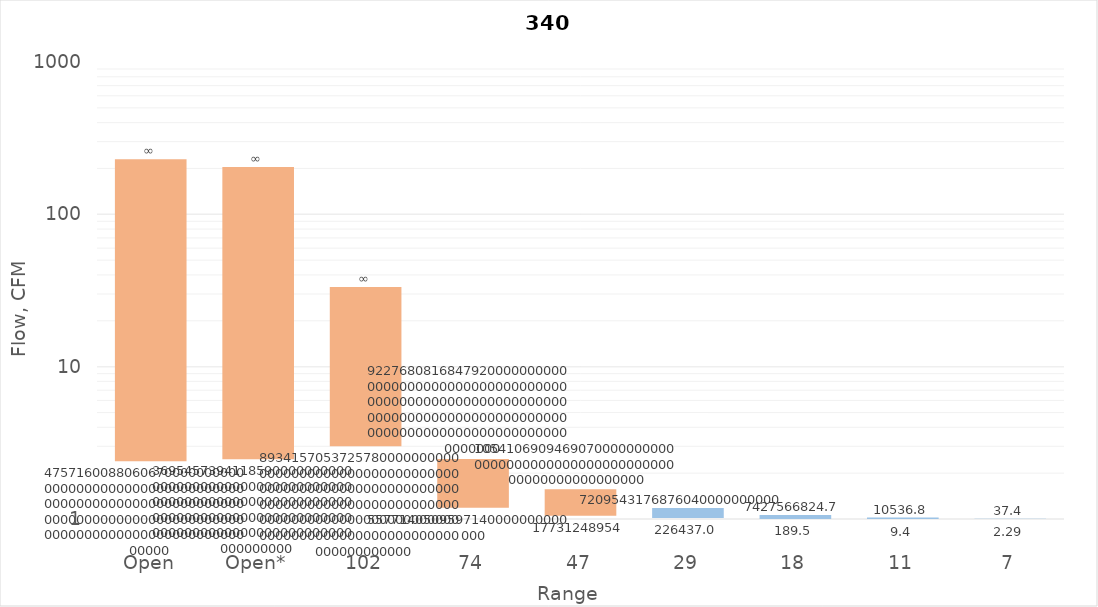
| Category | min Flow, CFM | delta | max Flow, CFM |
|---|---|---|---|
| Open | 129.677 | 657.512 | 787.189 |
| Open* | 133.568 | 636.934 | 770.501 |
| 102 | 161.951 | 346.39 | 508.341 |
| 74 | 27.746 | 104.219 | 131.965 |
| 47 | 10.249 | 55.774 | 66.023 |
| 29 | 5.355 | 19.503 | 24.858 |
| 18 | 2.278 | 7.593 | 9.871 |
| 11 | 0.975 | 3.048 | 4.023 |
| 7 | 0.359 | 1.214 | 1.573 |